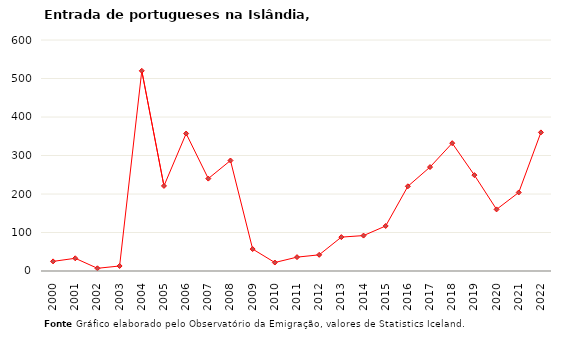
| Category | Entradas |
|---|---|
| 2000.0 | 25 |
| 2001.0 | 33 |
| 2002.0 | 7 |
| 2003.0 | 13 |
| 2004.0 | 520 |
| 2005.0 | 221 |
| 2006.0 | 357 |
| 2007.0 | 240 |
| 2008.0 | 287 |
| 2009.0 | 57 |
| 2010.0 | 22 |
| 2011.0 | 36 |
| 2012.0 | 42 |
| 2013.0 | 88 |
| 2014.0 | 92 |
| 2015.0 | 117 |
| 2016.0 | 220 |
| 2017.0 | 270 |
| 2018.0 | 332 |
| 2019.0 | 249 |
| 2020.0 | 160 |
| 2021.0 | 204 |
| 2022.0 | 360 |